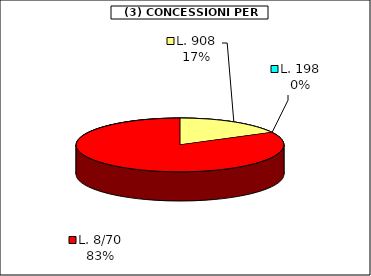
| Category | Series 0 |
|---|---|
| L. 908 | 14181.125 |
| L. 198 | 0 |
| L. 8/70 | 67728 |